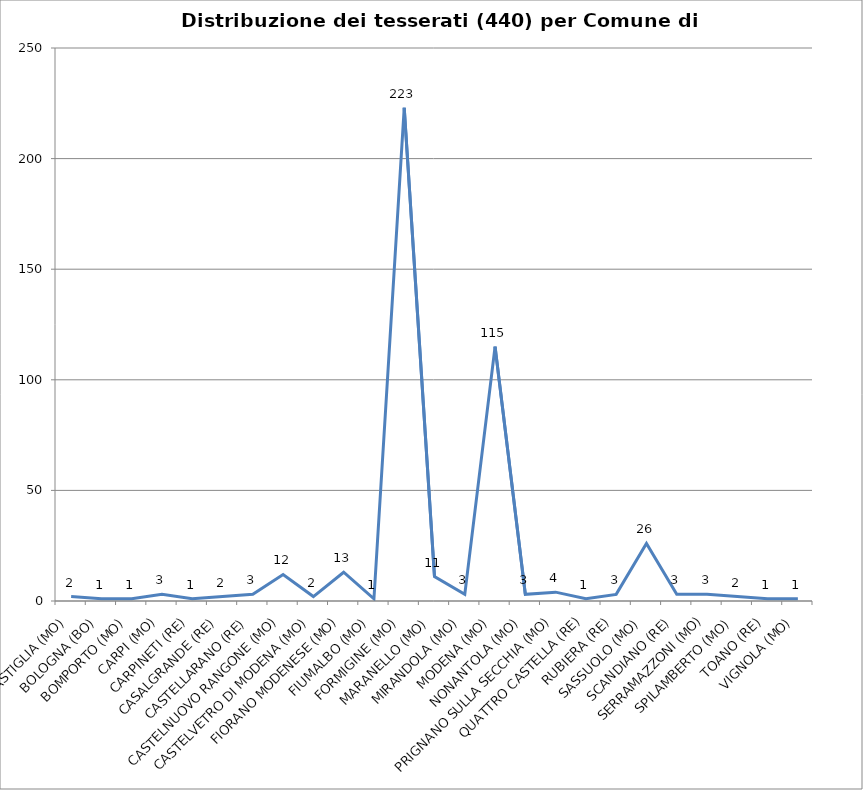
| Category | Nr. Tesserati |
|---|---|
| BASTIGLIA (MO) | 2 |
| BOLOGNA (BO) | 1 |
| BOMPORTO (MO) | 1 |
| CARPI (MO) | 3 |
| CARPINETI (RE) | 1 |
| CASALGRANDE (RE) | 2 |
| CASTELLARANO (RE) | 3 |
| CASTELNUOVO RANGONE (MO) | 12 |
| CASTELVETRO DI MODENA (MO) | 2 |
| FIORANO MODENESE (MO) | 13 |
| FIUMALBO (MO) | 1 |
| FORMIGINE (MO) | 223 |
| MARANELLO (MO) | 11 |
| MIRANDOLA (MO) | 3 |
| MODENA (MO) | 115 |
| NONANTOLA (MO) | 3 |
| PRIGNANO SULLA SECCHIA (MO) | 4 |
| QUATTRO CASTELLA (RE) | 1 |
| RUBIERA (RE) | 3 |
| SASSUOLO (MO) | 26 |
| SCANDIANO (RE) | 3 |
| SERRAMAZZONI (MO) | 3 |
| SPILAMBERTO (MO) | 2 |
| TOANO (RE) | 1 |
| VIGNOLA (MO) | 1 |